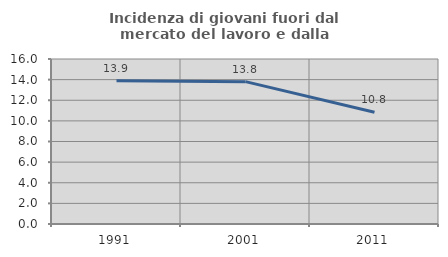
| Category | Incidenza di giovani fuori dal mercato del lavoro e dalla formazione  |
|---|---|
| 1991.0 | 13.89 |
| 2001.0 | 13.803 |
| 2011.0 | 10.841 |